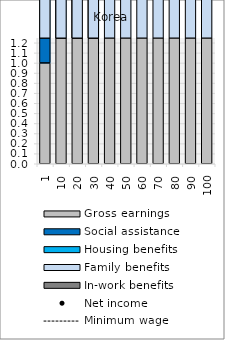
| Category | Gross earnings | Social assistance | Housing benefits | Family benefits | In-work benefits |
|---|---|---|---|---|---|
| 1.0 | 1 | 27.001 | 5.139 | 5.593 | 0 |
| 10.0 | 10 | 20.074 | 3.821 | 5.593 | 0 |
| 20.0 | 20 | 12.377 | 2.356 | 5.593 | 0 |
| 30.0 | 30 | 4.681 | 0.891 | 5.593 | 0 |
| 40.0 | 40 | 0 | 0 | 5.593 | 0 |
| 50.0 | 50 | 0 | 0 | 5.593 | 0 |
| 60.0 | 60 | 0 | 0 | 5.593 | 0 |
| 70.0 | 70 | 0 | 0 | 5.593 | 0 |
| 80.0 | 80 | 0 | 0 | 5.593 | 0 |
| 90.0 | 90 | 0 | 0 | 5.593 | 0 |
| 100.0 | 100 | 0 | 0 | 5.593 | 0 |